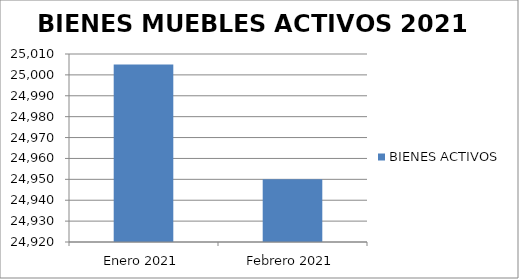
| Category | BIENES ACTIVOS |
|---|---|
| Enero 2021 | 25005 |
| Febrero 2021 | 24950 |